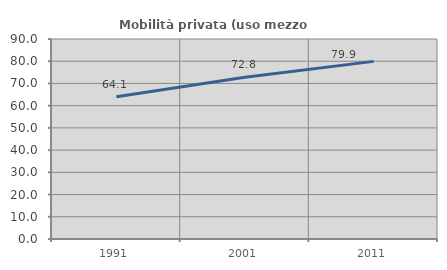
| Category | Mobilità privata (uso mezzo privato) |
|---|---|
| 1991.0 | 64.052 |
| 2001.0 | 72.781 |
| 2011.0 | 79.933 |